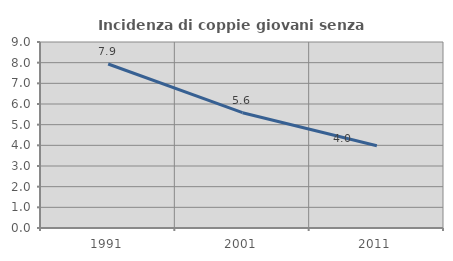
| Category | Incidenza di coppie giovani senza figli |
|---|---|
| 1991.0 | 7.935 |
| 2001.0 | 5.579 |
| 2011.0 | 3.976 |